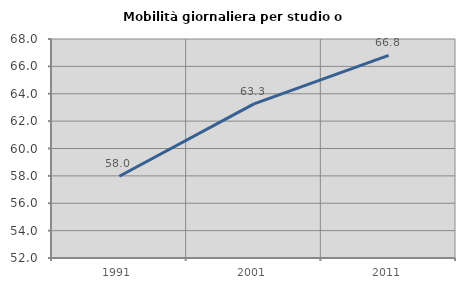
| Category | Mobilità giornaliera per studio o lavoro |
|---|---|
| 1991.0 | 57.97 |
| 2001.0 | 63.259 |
| 2011.0 | 66.798 |